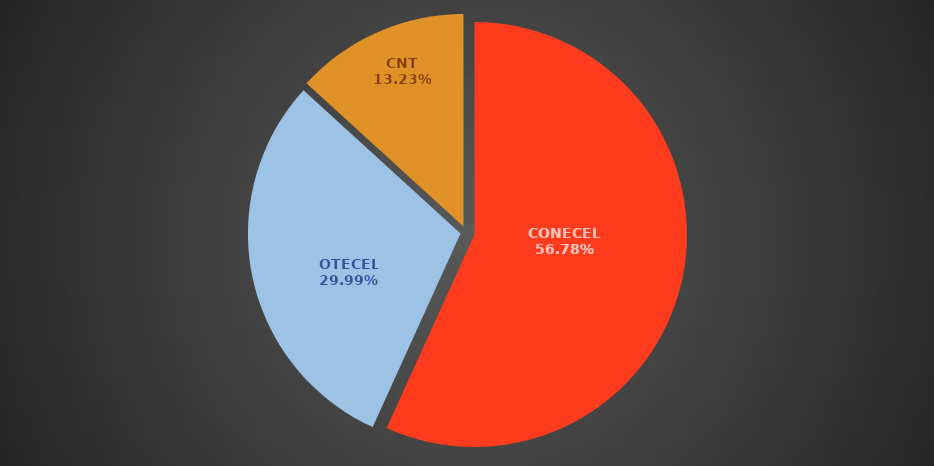
| Category | Oct 2017 |
|---|---|
| CONECEL | 8521547 |
| OTECEL | 4501316 |
| CNT | 1985926 |